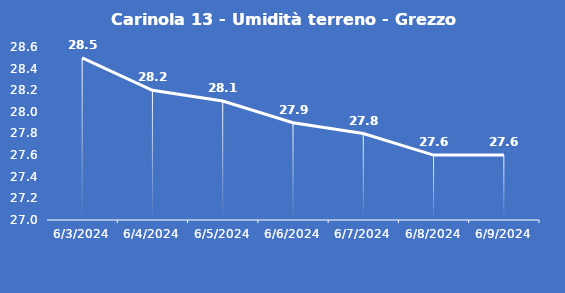
| Category | Carinola 13 - Umidità terreno - Grezzo (%VWC) |
|---|---|
| 6/3/24 | 28.5 |
| 6/4/24 | 28.2 |
| 6/5/24 | 28.1 |
| 6/6/24 | 27.9 |
| 6/7/24 | 27.8 |
| 6/8/24 | 27.6 |
| 6/9/24 | 27.6 |